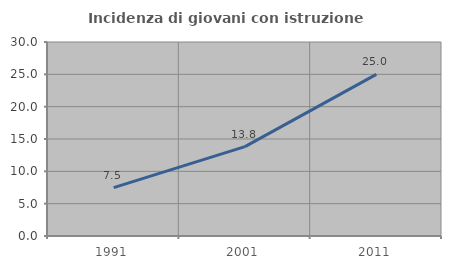
| Category | Incidenza di giovani con istruzione universitaria |
|---|---|
| 1991.0 | 7.485 |
| 2001.0 | 13.814 |
| 2011.0 | 25 |